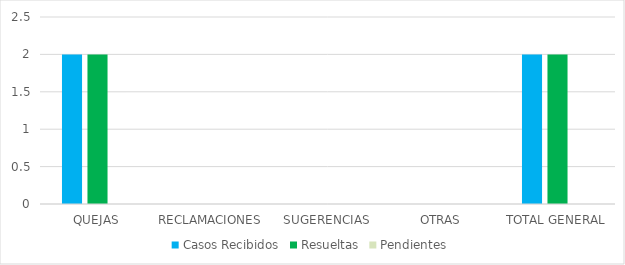
| Category | Casos Recibidos | Resueltas | Pendientes |
|---|---|---|---|
| QUEJAS | 2 | 2 | 0 |
| RECLAMACIONES | 0 | 0 | 0 |
| SUGERENCIAS | 0 | 0 | 0 |
| OTRAS | 0 | 0 | 0 |
| TOTAL GENERAL | 2 | 2 | 0 |